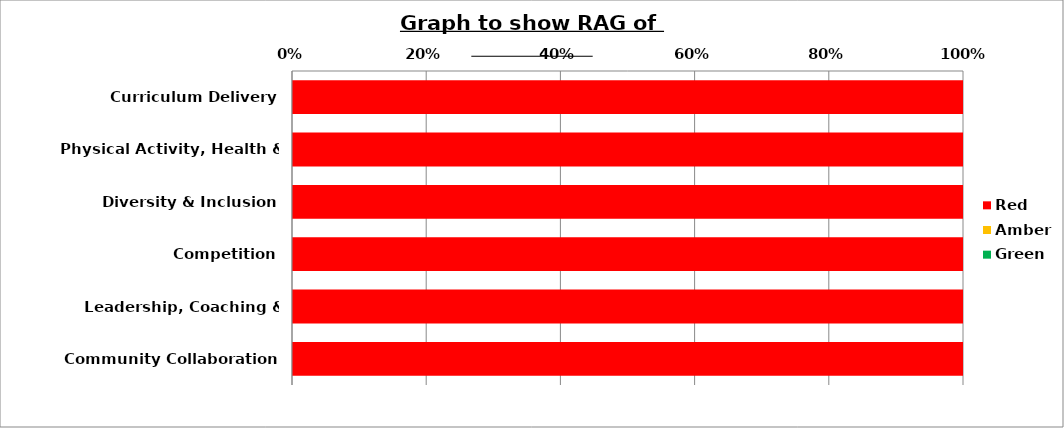
| Category | Red | Amber | Green |
|---|---|---|---|
| Curriculum Delivery | 100 | 0 | 0 |
| Physical Activity, Health & Wellbeing | 100 | 0 | 0 |
| Diversity & Inclusion | 100 | 0 | 0 |
| Competition | 100 | 0 | 0 |
| Leadership, Coaching & Volunteering | 100 | 0 | 0 |
| Community Collaboration | 100 | 0 | 0 |